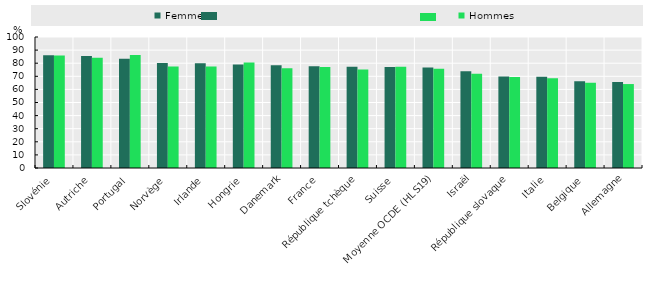
| Category | Femmes | Hommes |
|---|---|---|
| Slovénie | 86.09 | 85.84 |
| Autriche | 85.53 | 84.12 |
| Portugal | 83.49 | 86.29 |
| Norvège | 80.14 | 77.42 |
| Irlande | 80.03 | 77.52 |
| Hongrie | 79.04 | 80.61 |
| Danemark | 78.42 | 76.23 |
| France | 77.73 | 77.16 |
| République tchèque | 77.38 | 75.15 |
| Suisse | 77.15 | 77.36 |
| Moyenne OCDE (HLS19) | 76.699 | 75.792 |
| Israël | 73.85 | 72.02 |
| République slovaque | 69.87 | 69.47 |
| Italie | 69.73 | 68.44 |
| Belgique | 66.3 | 65.17 |
| Allemagne | 65.74 | 64.08 |